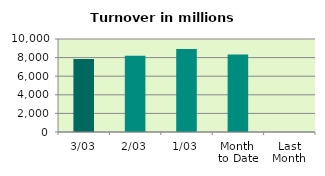
| Category | Series 0 |
|---|---|
| 3/03 | 7842.905 |
| 2/03 | 8198.544 |
| 1/03 | 8930.586 |
| Month 
to Date | 8324.012 |
| Last
Month | 0 |